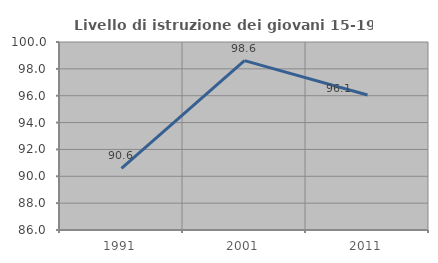
| Category | Livello di istruzione dei giovani 15-19 anni |
|---|---|
| 1991.0 | 90.588 |
| 2001.0 | 98.611 |
| 2011.0 | 96.053 |